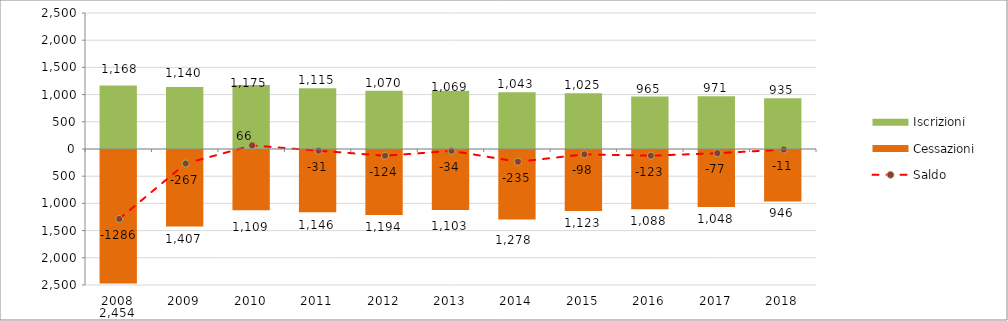
| Category | Iscrizioni | Cessazioni |
|---|---|---|
| 2008.0 | 1168 | -2454 |
| 2009.0 | 1140 | -1407 |
| 2010.0 | 1175 | -1109 |
| 2011.0 | 1115 | -1146 |
| 2012.0 | 1070 | -1194 |
| 2013.0 | 1069 | -1103 |
| 2014.0 | 1043 | -1278 |
| 2015.0 | 1025 | -1123 |
| 2016.0 | 965 | -1088 |
| 2017.0 | 971 | -1048 |
| 2018.0 | 935 | -946 |